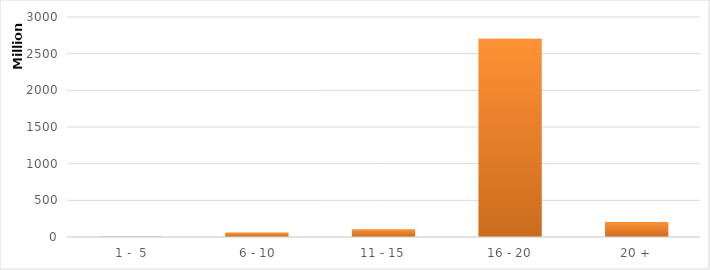
| Category | Series 0 |
|---|---|
|  1 -  5 | 7408923.92 |
|  6 - 10 | 61675145.97 |
| 11 - 15 | 105590912.16 |
| 16 - 20 | 2702435540.82 |
| 20 + | 204133857.45 |